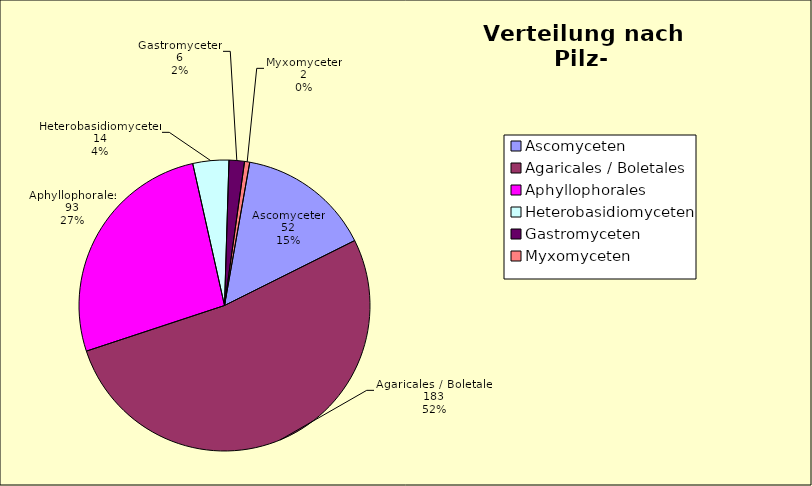
| Category | Series 0 |
|---|---|
| Ascomyceten | 52 |
| Agaricales / Boletales | 183 |
| Aphyllophorales | 93 |
| Heterobasidiomyceten | 14 |
| Gastromyceten | 6 |
| Myxomyceten | 2 |